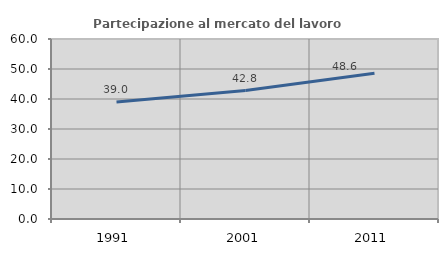
| Category | Partecipazione al mercato del lavoro  femminile |
|---|---|
| 1991.0 | 38.982 |
| 2001.0 | 42.814 |
| 2011.0 | 48.599 |